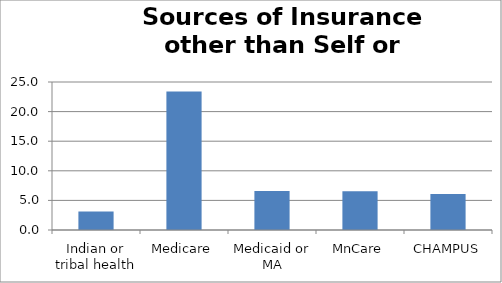
| Category | Series 0 |
|---|---|
| Indian or tribal health | 3.123 |
| Medicare | 23.414 |
| Medicaid or MA | 6.598 |
| MnCare | 6.535 |
| CHAMPUS | 6.081 |